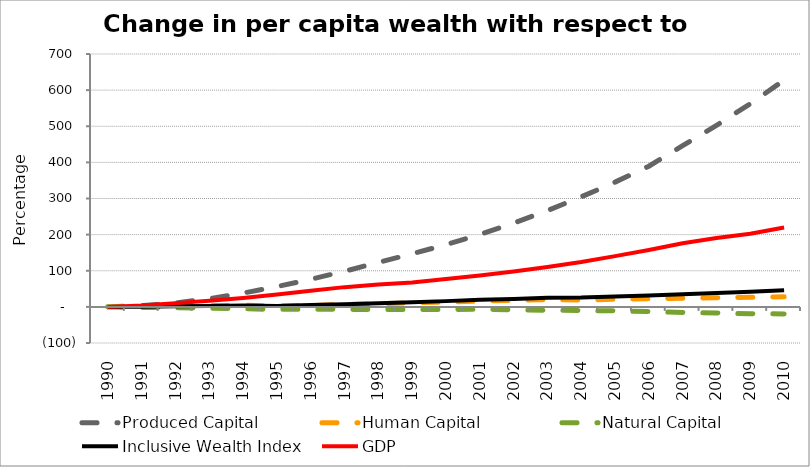
| Category | Produced Capital  | Human Capital | Natural Capital | Inclusive Wealth Index | GDP |
|---|---|---|---|---|---|
| 1990.0 | 0 | 0 | 0 | 0 | 0 |
| 1991.0 | 3.276 | 1.149 | -1.665 | 0.511 | 3.744 |
| 1992.0 | 10.836 | 2.248 | -2.359 | 1.464 | 10.375 |
| 1993.0 | 22.585 | 3.37 | -3.863 | 2.43 | 16.898 |
| 1994.0 | 38.233 | 4.653 | -5.286 | 3.727 | 24.866 |
| 1995.0 | 56.139 | 2.586 | -7.057 | 2.755 | 34.489 |
| 1996.0 | 76.498 | 4.317 | -6.175 | 5.208 | 44.88 |
| 1997.0 | 98.558 | 6.42 | -6.825 | 7.597 | 54.644 |
| 1998.0 | 123.17 | 8.757 | -7.308 | 10.319 | 61.627 |
| 1999.0 | 146.807 | 11.089 | -7.284 | 13.123 | 67.448 |
| 2000.0 | 172.42 | 13.272 | -7.304 | 15.915 | 76.847 |
| 2001.0 | 200.375 | 15.958 | -6.357 | 19.425 | 86.971 |
| 2002.0 | 231.812 | 18.207 | -7.979 | 22.133 | 98.043 |
| 2003.0 | 266.663 | 20.175 | -9.241 | 24.918 | 110.292 |
| 2004.0 | 304.528 | 19.048 | -10.089 | 25.849 | 124.232 |
| 2005.0 | 345.301 | 21.051 | -11.014 | 29.049 | 140.535 |
| 2006.0 | 389.311 | 22.529 | -13.163 | 31.729 | 157.496 |
| 2007.0 | 446.214 | 24.027 | -15.398 | 35.056 | 176.21 |
| 2008.0 | 502.43 | 25.461 | -16.931 | 38.491 | 190.414 |
| 2009.0 | 562.16 | 26.761 | -18.925 | 41.891 | 202.532 |
| 2010.0 | 627.707 | 28.006 | -19.541 | 45.914 | 219.572 |